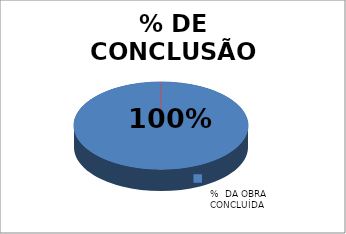
| Category | Series 0 | Series 1 |
|---|---|---|
|  | 1 |  |